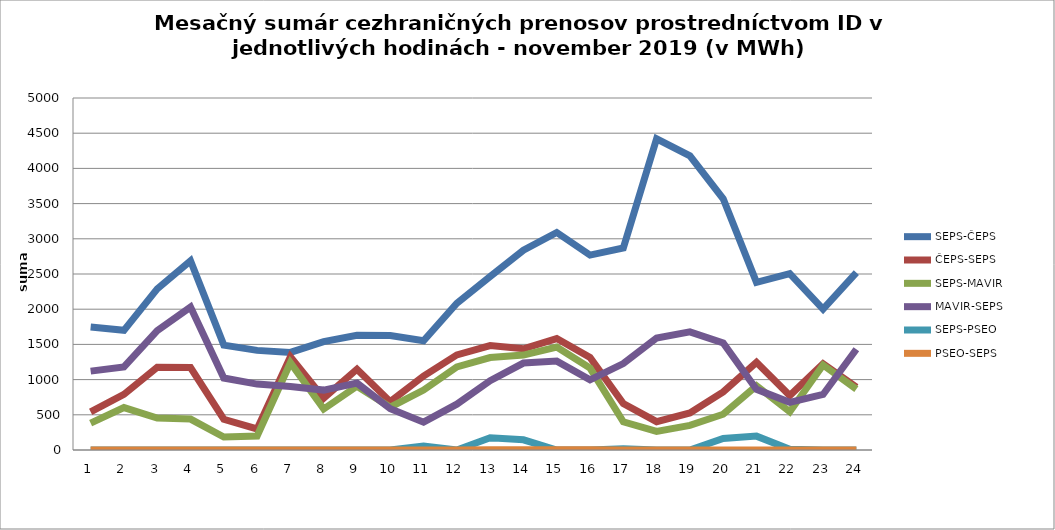
| Category | SEPS-ČEPS | ČEPS-SEPS | SEPS-MAVIR | MAVIR-SEPS | SEPS-PSEO | PSEO-SEPS |
|---|---|---|---|---|---|---|
| 1.0 | 1746 | 542 | 382 | 1120 | 0 | 0 |
| 2.0 | 1700 | 790 | 603 | 1181 | 0 | 0 |
| 3.0 | 2288 | 1176 | 455 | 1694 | 0 | 0 |
| 4.0 | 2687 | 1171 | 439 | 2030 | 0 | 0 |
| 5.0 | 1490 | 437 | 184 | 1022 | 0 | 0 |
| 6.0 | 1415 | 299 | 199 | 936 | 0 | 0 |
| 7.0 | 1386 | 1324 | 1239 | 902 | 0 | 0 |
| 8.0 | 1540 | 735 | 582 | 851 | 0 | 0 |
| 9.0 | 1629 | 1148 | 906 | 950 | 0 | 0 |
| 10.0 | 1626 | 687 | 608 | 586 | 0 | 0 |
| 11.0 | 1552 | 1051 | 851 | 395 | 55 | 0 |
| 12.0 | 2085 | 1351 | 1181 | 651 | 0 | 0 |
| 13.0 | 2463 | 1484 | 1313 | 984 | 175 | 3 |
| 14.0 | 2838 | 1438 | 1348 | 1235 | 145 | 3 |
| 15.0 | 3090 | 1583 | 1463 | 1263 | 0 | 3 |
| 16.0 | 2768 | 1314 | 1164 | 996 | 0 | 3 |
| 17.0 | 2870 | 659 | 401 | 1227 | 18 | 0 |
| 18.0 | 4420 | 402 | 264 | 1591 | 0 | 0 |
| 19.0 | 4179 | 527 | 350 | 1678 | 0 | 0 |
| 20.0 | 3568 | 826 | 508 | 1520 | 165 | 0 |
| 21.0 | 2381 | 1245 | 913 | 863 | 197 | 0 |
| 22.0 | 2504 | 774 | 543 | 677 | 10 | 0 |
| 23.0 | 2002 | 1225 | 1207 | 789 | 0 | 0 |
| 24.0 | 2518 | 894 | 865 | 1431 | 0 | 0 |